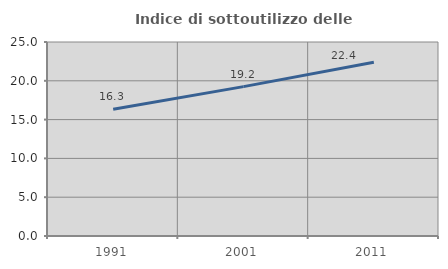
| Category | Indice di sottoutilizzo delle abitazioni  |
|---|---|
| 1991.0 | 16.345 |
| 2001.0 | 19.248 |
| 2011.0 | 22.382 |